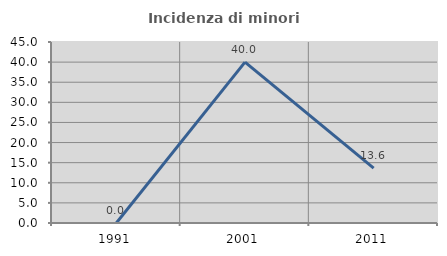
| Category | Incidenza di minori stranieri |
|---|---|
| 1991.0 | 0 |
| 2001.0 | 40 |
| 2011.0 | 13.636 |